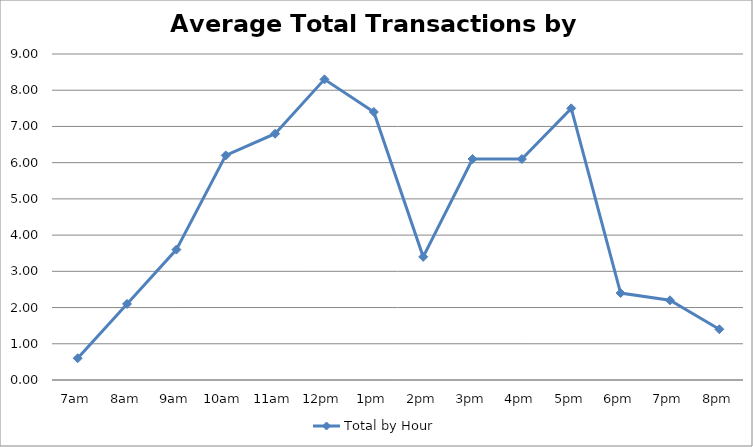
| Category | Total by Hour |
|---|---|
| 7am | 0.6 |
| 8am | 2.1 |
| 9am | 3.6 |
| 10am | 6.2 |
| 11am | 6.8 |
| 12pm | 8.3 |
| 1pm | 7.4 |
| 2pm | 3.4 |
| 3pm | 6.1 |
| 4pm | 6.1 |
| 5pm | 7.5 |
| 6pm | 2.4 |
| 7pm | 2.2 |
| 8pm | 1.4 |